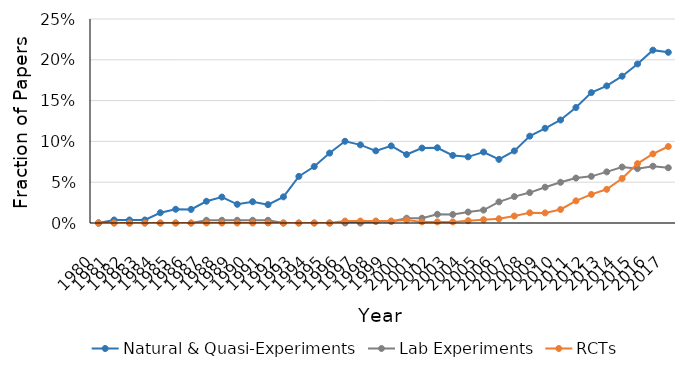
| Category | Natural & Quasi-Experiments | Lab Experiments | RCTs |
|---|---|---|---|
| 1980.0 | 0 | 0 | 0 |
| 1981.0 | 0.004 | 0 | 0 |
| 1982.0 | 0.004 | 0 | 0 |
| 1983.0 | 0.004 | 0 | 0 |
| 1984.0 | 0.013 | 0 | 0 |
| 1985.0 | 0.017 | 0 | 0 |
| 1986.0 | 0.017 | 0 | 0 |
| 1987.0 | 0.027 | 0.003 | 0 |
| 1988.0 | 0.032 | 0.003 | 0 |
| 1989.0 | 0.023 | 0.003 | 0 |
| 1990.0 | 0.026 | 0.003 | 0 |
| 1991.0 | 0.023 | 0.003 | 0 |
| 1992.0 | 0.032 | 0 | 0 |
| 1993.0 | 0.057 | 0 | 0 |
| 1994.0 | 0.069 | 0 | 0 |
| 1995.0 | 0.086 | 0 | 0 |
| 1996.0 | 0.1 | 0 | 0.002 |
| 1997.0 | 0.096 | 0 | 0.002 |
| 1998.0 | 0.088 | 0.002 | 0.002 |
| 1999.0 | 0.094 | 0.002 | 0.002 |
| 2000.0 | 0.084 | 0.006 | 0.004 |
| 2001.0 | 0.092 | 0.006 | 0.001 |
| 2002.0 | 0.092 | 0.011 | 0.001 |
| 2003.0 | 0.083 | 0.01 | 0.001 |
| 2004.0 | 0.081 | 0.013 | 0.003 |
| 2005.0 | 0.087 | 0.016 | 0.004 |
| 2006.0 | 0.078 | 0.026 | 0.005 |
| 2007.0 | 0.088 | 0.032 | 0.009 |
| 2008.0 | 0.106 | 0.037 | 0.012 |
| 2009.0 | 0.116 | 0.044 | 0.012 |
| 2010.0 | 0.126 | 0.05 | 0.017 |
| 2011.0 | 0.142 | 0.055 | 0.027 |
| 2012.0 | 0.16 | 0.057 | 0.035 |
| 2013.0 | 0.168 | 0.063 | 0.041 |
| 2014.0 | 0.18 | 0.069 | 0.055 |
| 2015.0 | 0.195 | 0.067 | 0.073 |
| 2016.0 | 0.212 | 0.07 | 0.085 |
| 2017.0 | 0.209 | 0.068 | 0.094 |